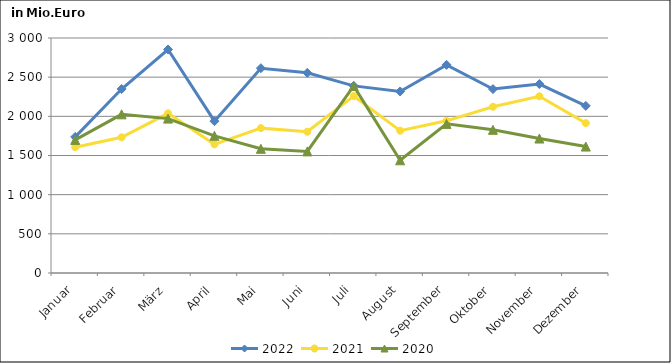
| Category | 2022 | 2021 | 2020 |
|---|---|---|---|
| Januar | 1737.76 | 1606.334 | 1698.945 |
| Februar | 2349.062 | 1732.356 | 2025.596 |
| März | 2853.363 | 2038.222 | 1971.023 |
| April | 1938.4 | 1642.627 | 1751.111 |
| Mai | 2614.254 | 1849.313 | 1585.509 |
| Juni | 2555.184 | 1802.572 | 1552.423 |
| Juli | 2388.649 | 2258.294 | 2387.266 |
| August | 2317.411 | 1816.7 | 1438.817 |
| September | 2657.292 | 1942.578 | 1903.707 |
| Oktober | 2348.168 | 2121.913 | 1827.871 |
| November | 2411.878 | 2255.776 | 1716.501 |
| Dezember | 2133.407 | 1913.008 | 1614.257 |